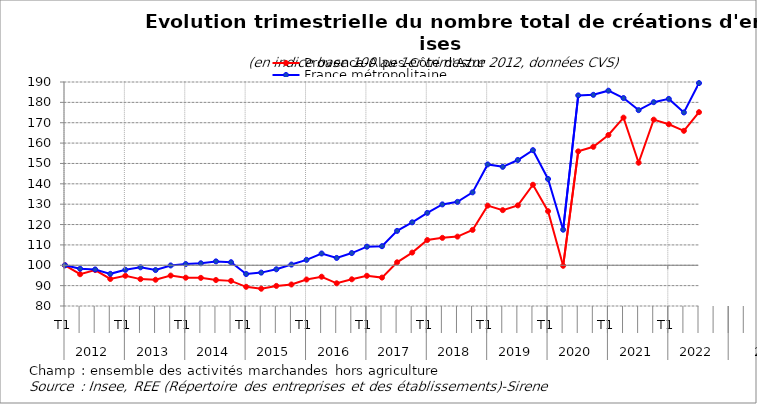
| Category | Provence-Alpes-Côte d'Azur | France métropolitaine |
|---|---|---|
| 0 | 100 | 100 |
| 1 | 95.606 | 98.297 |
| 2 | 97.666 | 97.95 |
| 3 | 93.272 | 95.794 |
| 4 | 94.855 | 97.78 |
| 5 | 93.204 | 98.998 |
| 6 | 92.893 | 97.662 |
| 7 | 94.948 | 99.916 |
| 8 | 93.899 | 100.601 |
| 9 | 93.812 | 100.982 |
| 10 | 92.757 | 101.909 |
| 11 | 92.341 | 101.496 |
| 12 | 89.418 | 95.696 |
| 13 | 88.481 | 96.396 |
| 14 | 89.871 | 98.02 |
| 15 | 90.566 | 100.342 |
| 16 | 93.011 | 102.662 |
| 17 | 94.383 | 105.788 |
| 18 | 91.149 | 103.602 |
| 19 | 93.117 | 105.995 |
| 20 | 94.83 | 109.128 |
| 21 | 93.955 | 109.371 |
| 22 | 101.459 | 116.888 |
| 23 | 106.238 | 121.096 |
| 24 | 112.388 | 125.722 |
| 25 | 113.462 | 129.889 |
| 26 | 114.07 | 131.14 |
| 27 | 117.366 | 135.808 |
| 28 | 129.283 | 149.516 |
| 29 | 127.079 | 148.341 |
| 30 | 129.413 | 151.696 |
| 31 | 139.542 | 156.526 |
| 32 | 126.558 | 142.382 |
| 33 | 99.746 | 117.472 |
| 34 | 155.933 | 183.419 |
| 35 | 158.168 | 183.7 |
| 36 | 163.971 | 185.736 |
| 37 | 172.505 | 182.131 |
| 38 | 150.366 | 176.187 |
| 39 | 171.506 | 180.09 |
| 40 | 169.247 | 181.703 |
| 41 | 166.025 | 175.05 |
| 42 | 175.18 | 189.46 |